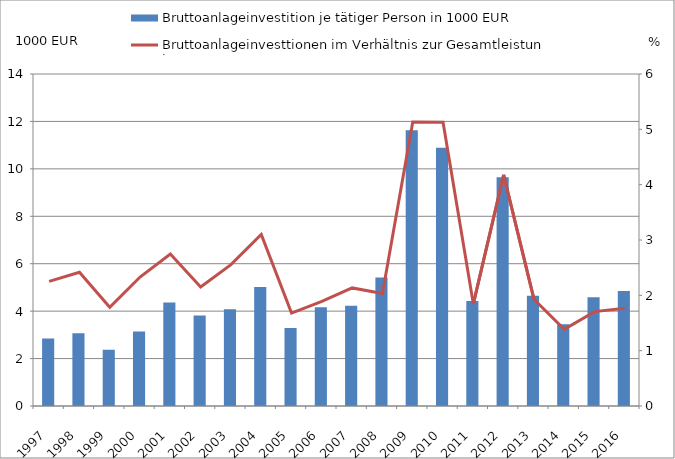
| Category | Bruttoanlageinvestition je tätiger Person in 1000 EUR |
|---|---|
| 1997.0 | 2.851 |
| 1998.0 | 3.063 |
| 1999.0 | 2.372 |
| 2000.0 | 3.138 |
| 2001.0 | 4.367 |
| 2002.0 | 3.814 |
| 2003.0 | 4.083 |
| 2004.0 | 5.015 |
| 2005.0 | 3.288 |
| 2006.0 | 4.165 |
| 2007.0 | 4.227 |
| 2008.0 | 5.419 |
| 2009.0 | 11.626 |
| 2010.0 | 10.891 |
| 2011.0 | 4.427 |
| 2012.0 | 9.648 |
| 2013.0 | 4.651 |
| 2014.0 | 3.447 |
| 2015.0 | 4.586 |
| 2016.0 | 4.852 |